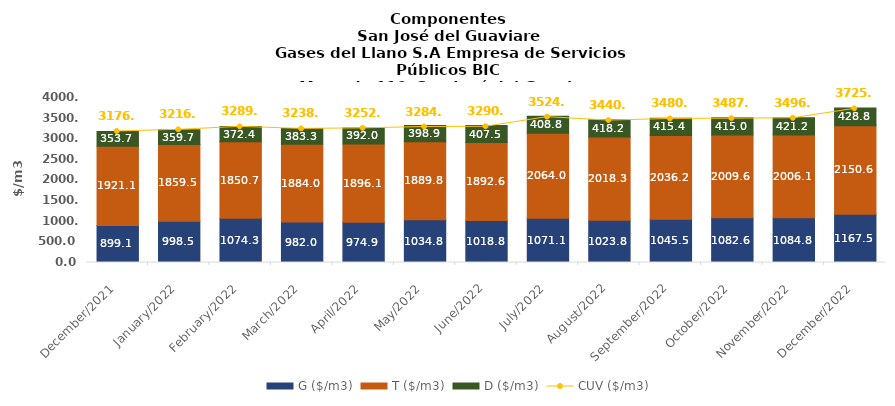
| Category | G ($/m3) | T ($/m3) | D ($/m3) |
|---|---|---|---|
| 2021-12-01 | 899.1 | 1921.09 | 353.72 |
| 2022-01-01 | 998.53 | 1859.54 | 359.67 |
| 2022-02-01 | 1074.31 | 1850.74 | 372.35 |
| 2022-03-01 | 981.99 | 1884.02 | 383.3 |
| 2022-04-01 | 974.88 | 1896.14 | 391.95 |
| 2022-05-01 | 1034.82 | 1889.75 | 398.91 |
| 2022-06-01 | 1018.78 | 1892.55 | 407.54 |
| 2022-07-01 | 1071.1 | 2063.95 | 408.78 |
| 2022-08-01 | 1023.83 | 2018.26 | 418.18 |
| 2022-09-01 | 1045.5 | 2036.21 | 415.42 |
| 2022-10-01 | 1082.55 | 2009.58 | 414.99 |
| 2022-11-01 | 1084.79 | 2006.14 | 421.15 |
| 2022-12-01 | 1167.54 | 2150.64 | 428.78 |